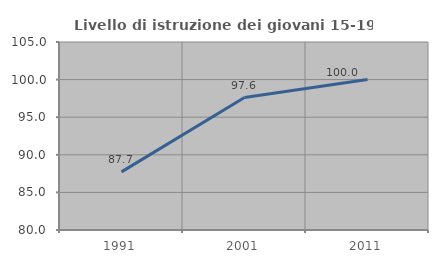
| Category | Livello di istruzione dei giovani 15-19 anni |
|---|---|
| 1991.0 | 87.73 |
| 2001.0 | 97.619 |
| 2011.0 | 100 |